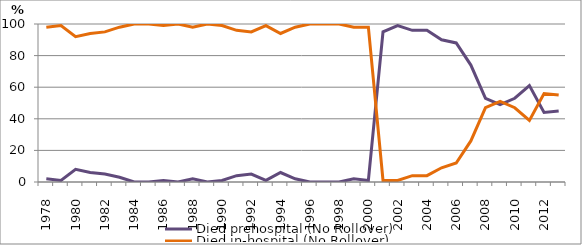
| Category | Died prehospital (No Rollover) | Died in-hospital (No Rollover) |
|---|---|---|
| 1978.0 | 2 | 98 |
| 1979.0 | 1 | 99 |
| 1980.0 | 8 | 92 |
| 1981.0 | 6 | 94 |
| 1982.0 | 5 | 95 |
| 1983.0 | 3 | 98 |
| 1984.0 | 0 | 100 |
| 1985.0 | 0 | 100 |
| 1986.0 | 1 | 99 |
| 1987.0 | 0 | 100 |
| 1988.0 | 2 | 98 |
| 1989.0 | 0 | 100 |
| 1990.0 | 1 | 99 |
| 1991.0 | 4 | 96 |
| 1992.0 | 5 | 95 |
| 1993.0 | 1 | 99 |
| 1994.0 | 6 | 94 |
| 1995.0 | 2 | 98 |
| 1996.0 | 0 | 100 |
| 1997.0 | 0 | 100 |
| 1998.0 | 0 | 100 |
| 1999.0 | 2 | 98 |
| 2000.0 | 1 | 98 |
| 2001.0 | 95 | 1 |
| 2002.0 | 99 | 1 |
| 2003.0 | 96 | 4 |
| 2004.0 | 96 | 4 |
| 2005.0 | 90 | 9 |
| 2006.0 | 88 | 12 |
| 2007.0 | 74 | 26 |
| 2008.0 | 53 | 47 |
| 2009.0 | 49 | 51 |
| 2010.0 | 53 | 47 |
| 2011.0 | 61 | 39 |
| 2012.0 | 44 | 56 |
| 2013.0 | 45 | 55 |